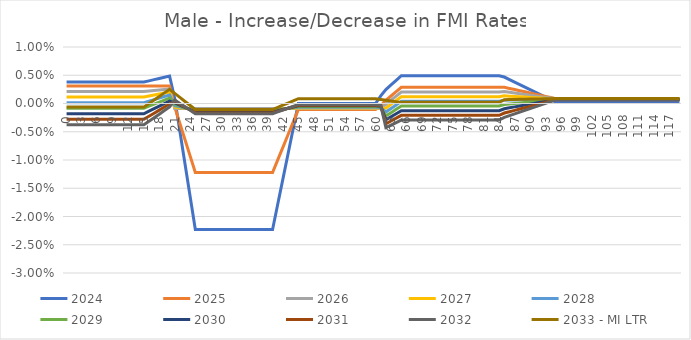
| Category | 2024 | 2025 | 2026 | 2027 | 2028 | 2029 | 2030 | 2031 | 2032 | 2033 - MI LTR |
|---|---|---|---|---|---|---|---|---|---|---|
| 0.0 | 0.004 | 0.003 | 0.002 | 0.001 | 0 | -0.001 | -0.002 | -0.003 | -0.004 | -0.001 |
| 1.0 | 0.004 | 0.003 | 0.002 | 0.001 | 0 | -0.001 | -0.002 | -0.003 | -0.004 | -0.001 |
| 2.0 | 0.004 | 0.003 | 0.002 | 0.001 | 0 | -0.001 | -0.002 | -0.003 | -0.004 | -0.001 |
| 3.0 | 0.004 | 0.003 | 0.002 | 0.001 | 0 | -0.001 | -0.002 | -0.003 | -0.004 | -0.001 |
| 4.0 | 0.004 | 0.003 | 0.002 | 0.001 | 0 | -0.001 | -0.002 | -0.003 | -0.004 | -0.001 |
| 5.0 | 0.004 | 0.003 | 0.002 | 0.001 | 0 | -0.001 | -0.002 | -0.003 | -0.004 | -0.001 |
| 6.0 | 0.004 | 0.003 | 0.002 | 0.001 | 0 | -0.001 | -0.002 | -0.003 | -0.004 | -0.001 |
| 7.0 | 0.004 | 0.003 | 0.002 | 0.001 | 0 | -0.001 | -0.002 | -0.003 | -0.004 | -0.001 |
| 8.0 | 0.004 | 0.003 | 0.002 | 0.001 | 0 | -0.001 | -0.002 | -0.003 | -0.004 | -0.001 |
| 9.0 | 0.004 | 0.003 | 0.002 | 0.001 | 0 | -0.001 | -0.002 | -0.003 | -0.004 | -0.001 |
| 10.0 | 0.004 | 0.003 | 0.002 | 0.001 | 0 | -0.001 | -0.002 | -0.003 | -0.004 | -0.001 |
| 11.0 | 0.004 | 0.003 | 0.002 | 0.001 | 0 | -0.001 | -0.002 | -0.003 | -0.004 | -0.001 |
| 12.0 | 0.004 | 0.003 | 0.002 | 0.001 | 0 | -0.001 | -0.002 | -0.003 | -0.004 | -0.001 |
| 13.0 | 0.004 | 0.003 | 0.002 | 0.001 | 0 | -0.001 | -0.002 | -0.003 | -0.004 | -0.001 |
| 14.0 | 0.004 | 0.003 | 0.002 | 0.001 | 0 | -0.001 | -0.002 | -0.003 | -0.004 | -0.001 |
| 15.0 | 0.004 | 0.003 | 0.002 | 0.001 | 0 | -0.001 | -0.002 | -0.003 | -0.004 | -0.001 |
| 16.0 | 0.004 | 0.003 | 0.002 | 0.001 | 0 | 0 | -0.001 | -0.002 | -0.003 | 0 |
| 17.0 | 0.004 | 0.003 | 0.002 | 0.001 | 0.001 | 0 | -0.001 | -0.002 | -0.003 | 0.001 |
| 18.0 | 0.004 | 0.003 | 0.002 | 0.002 | 0.001 | 0 | 0 | -0.001 | -0.002 | 0.001 |
| 19.0 | 0.005 | 0.003 | 0.002 | 0.002 | 0.001 | 0.001 | 0 | -0.001 | -0.001 | 0.002 |
| 20.0 | 0.005 | 0.003 | 0.003 | 0.002 | 0.002 | 0.001 | 0 | 0 | -0.001 | 0.003 |
| 21.0 | 0.001 | -0.001 | -0.001 | -0.001 | 0 | 0 | 0 | 0 | 0.001 | 0.002 |
| 22.0 | -0.005 | -0.004 | -0.001 | -0.001 | -0.001 | 0 | 0 | 0 | 0 | 0.001 |
| 23.0 | -0.011 | -0.006 | -0.001 | -0.001 | -0.001 | -0.001 | -0.001 | -0.001 | -0.001 | 0 |
| 24.0 | -0.017 | -0.009 | -0.001 | -0.001 | -0.001 | -0.001 | -0.001 | -0.001 | -0.001 | 0 |
| 25.0 | -0.022 | -0.012 | -0.001 | -0.001 | -0.001 | -0.001 | -0.002 | -0.002 | -0.002 | -0.001 |
| 26.0 | -0.022 | -0.012 | -0.001 | -0.001 | -0.001 | -0.001 | -0.002 | -0.002 | -0.002 | -0.001 |
| 27.0 | -0.022 | -0.012 | -0.001 | -0.001 | -0.001 | -0.001 | -0.002 | -0.002 | -0.002 | -0.001 |
| 28.0 | -0.022 | -0.012 | -0.001 | -0.001 | -0.001 | -0.001 | -0.002 | -0.002 | -0.002 | -0.001 |
| 29.0 | -0.022 | -0.012 | -0.001 | -0.001 | -0.001 | -0.001 | -0.002 | -0.002 | -0.002 | -0.001 |
| 30.0 | -0.022 | -0.012 | -0.001 | -0.001 | -0.001 | -0.001 | -0.002 | -0.002 | -0.002 | -0.001 |
| 31.0 | -0.022 | -0.012 | -0.001 | -0.001 | -0.001 | -0.001 | -0.002 | -0.002 | -0.002 | -0.001 |
| 32.0 | -0.022 | -0.012 | -0.001 | -0.001 | -0.001 | -0.001 | -0.002 | -0.002 | -0.002 | -0.001 |
| 33.0 | -0.022 | -0.012 | -0.001 | -0.001 | -0.001 | -0.001 | -0.002 | -0.002 | -0.002 | -0.001 |
| 34.0 | -0.022 | -0.012 | -0.001 | -0.001 | -0.001 | -0.001 | -0.002 | -0.002 | -0.002 | -0.001 |
| 35.0 | -0.022 | -0.012 | -0.001 | -0.001 | -0.001 | -0.001 | -0.002 | -0.002 | -0.002 | -0.001 |
| 36.0 | -0.022 | -0.012 | -0.001 | -0.001 | -0.001 | -0.001 | -0.002 | -0.002 | -0.002 | -0.001 |
| 37.0 | -0.022 | -0.012 | -0.001 | -0.001 | -0.001 | -0.001 | -0.002 | -0.002 | -0.002 | -0.001 |
| 38.0 | -0.022 | -0.012 | -0.001 | -0.001 | -0.001 | -0.001 | -0.002 | -0.002 | -0.002 | -0.001 |
| 39.0 | -0.022 | -0.012 | -0.001 | -0.001 | -0.001 | -0.001 | -0.002 | -0.002 | -0.002 | -0.001 |
| 40.0 | -0.022 | -0.012 | -0.001 | -0.001 | -0.001 | -0.001 | -0.002 | -0.002 | -0.002 | -0.001 |
| 41.0 | -0.018 | -0.01 | -0.001 | -0.001 | -0.001 | -0.001 | -0.001 | -0.001 | -0.001 | -0.001 |
| 42.0 | -0.013 | -0.008 | -0.001 | -0.001 | -0.001 | -0.001 | -0.001 | -0.001 | -0.001 | 0 |
| 43.0 | -0.009 | -0.006 | -0.001 | -0.001 | -0.001 | -0.001 | -0.001 | -0.001 | -0.001 | 0 |
| 44.0 | -0.004 | -0.003 | -0.001 | -0.001 | -0.001 | -0.001 | -0.001 | -0.001 | 0 | 0 |
| 45.0 | 0 | -0.001 | -0.001 | -0.001 | -0.001 | -0.001 | 0 | 0 | 0 | 0.001 |
| 46.0 | 0 | -0.001 | -0.001 | -0.001 | -0.001 | -0.001 | 0 | 0 | 0 | 0.001 |
| 47.0 | 0 | -0.001 | -0.001 | -0.001 | -0.001 | -0.001 | 0 | 0 | 0 | 0.001 |
| 48.0 | 0 | -0.001 | -0.001 | -0.001 | -0.001 | -0.001 | 0 | 0 | 0 | 0.001 |
| 49.0 | 0 | -0.001 | -0.001 | -0.001 | -0.001 | -0.001 | 0 | 0 | 0 | 0.001 |
| 50.0 | 0 | -0.001 | -0.001 | -0.001 | -0.001 | -0.001 | 0 | 0 | 0 | 0.001 |
| 51.0 | 0 | -0.001 | -0.001 | -0.001 | -0.001 | -0.001 | 0 | 0 | 0 | 0.001 |
| 52.0 | 0 | -0.001 | -0.001 | -0.001 | -0.001 | -0.001 | 0 | 0 | 0 | 0.001 |
| 53.0 | 0 | -0.001 | -0.001 | -0.001 | -0.001 | -0.001 | 0 | 0 | 0 | 0.001 |
| 54.0 | 0 | -0.001 | -0.001 | -0.001 | -0.001 | -0.001 | 0 | 0 | 0 | 0.001 |
| 55.0 | 0 | -0.001 | -0.001 | -0.001 | -0.001 | -0.001 | 0 | 0 | 0 | 0.001 |
| 56.0 | 0 | -0.001 | -0.001 | -0.001 | -0.001 | -0.001 | 0 | 0 | 0 | 0.001 |
| 57.0 | 0 | -0.001 | -0.001 | -0.001 | -0.001 | -0.001 | 0 | 0 | 0 | 0.001 |
| 58.0 | 0 | -0.001 | -0.001 | -0.001 | -0.001 | -0.001 | 0 | 0 | 0 | 0.001 |
| 59.0 | 0 | -0.001 | -0.001 | -0.001 | -0.001 | -0.001 | 0 | 0 | 0 | 0.001 |
| 60.0 | 0 | -0.001 | -0.001 | -0.001 | -0.001 | -0.001 | 0 | 0 | 0 | 0.001 |
| 61.0 | 0.001 | 0 | -0.001 | -0.001 | -0.001 | -0.001 | 0 | 0 | 0 | 0.001 |
| 62.0 | 0.002 | 0.001 | 0 | -0.001 | -0.002 | -0.002 | -0.003 | -0.004 | -0.004 | 0.001 |
| 63.0 | 0.003 | 0.001 | 0.001 | 0 | -0.001 | -0.002 | -0.002 | -0.003 | -0.004 | 0 |
| 64.0 | 0.004 | 0.002 | 0.001 | 0.001 | 0 | -0.001 | -0.002 | -0.003 | -0.003 | 0 |
| 65.0 | 0.005 | 0.003 | 0.002 | 0.001 | 0 | 0 | -0.001 | -0.002 | -0.003 | 0 |
| 66.0 | 0.005 | 0.003 | 0.002 | 0.001 | 0 | 0 | -0.001 | -0.002 | -0.003 | 0 |
| 67.0 | 0.005 | 0.003 | 0.002 | 0.001 | 0 | 0 | -0.001 | -0.002 | -0.003 | 0 |
| 68.0 | 0.005 | 0.003 | 0.002 | 0.001 | 0 | 0 | -0.001 | -0.002 | -0.003 | 0 |
| 69.0 | 0.005 | 0.003 | 0.002 | 0.001 | 0 | 0 | -0.001 | -0.002 | -0.003 | 0 |
| 70.0 | 0.005 | 0.003 | 0.002 | 0.001 | 0 | 0 | -0.001 | -0.002 | -0.003 | 0 |
| 71.0 | 0.005 | 0.003 | 0.002 | 0.001 | 0 | 0 | -0.001 | -0.002 | -0.003 | 0 |
| 72.0 | 0.005 | 0.003 | 0.002 | 0.001 | 0 | 0 | -0.001 | -0.002 | -0.003 | 0 |
| 73.0 | 0.005 | 0.003 | 0.002 | 0.001 | 0 | 0 | -0.001 | -0.002 | -0.003 | 0 |
| 74.0 | 0.005 | 0.003 | 0.002 | 0.001 | 0 | 0 | -0.001 | -0.002 | -0.003 | 0 |
| 75.0 | 0.005 | 0.003 | 0.002 | 0.001 | 0 | 0 | -0.001 | -0.002 | -0.003 | 0 |
| 76.0 | 0.005 | 0.003 | 0.002 | 0.001 | 0 | 0 | -0.001 | -0.002 | -0.003 | 0 |
| 77.0 | 0.005 | 0.003 | 0.002 | 0.001 | 0 | 0 | -0.001 | -0.002 | -0.003 | 0 |
| 78.0 | 0.005 | 0.003 | 0.002 | 0.001 | 0 | 0 | -0.001 | -0.002 | -0.003 | 0 |
| 79.0 | 0.005 | 0.003 | 0.002 | 0.001 | 0 | 0 | -0.001 | -0.002 | -0.003 | 0 |
| 80.0 | 0.005 | 0.003 | 0.002 | 0.001 | 0 | 0 | -0.001 | -0.002 | -0.003 | 0 |
| 81.0 | 0.005 | 0.003 | 0.002 | 0.001 | 0 | 0 | -0.001 | -0.002 | -0.003 | 0 |
| 82.0 | 0.005 | 0.003 | 0.002 | 0.001 | 0 | 0 | -0.001 | -0.002 | -0.003 | 0 |
| 83.0 | 0.005 | 0.003 | 0.002 | 0.001 | 0 | 0 | -0.001 | -0.002 | -0.003 | 0 |
| 84.0 | 0.005 | 0.003 | 0.002 | 0.001 | 0 | 0 | -0.001 | -0.002 | -0.003 | 0 |
| 85.0 | 0.005 | 0.003 | 0.002 | 0.001 | 0.001 | 0 | -0.001 | -0.002 | -0.002 | 0.001 |
| 86.0 | 0.004 | 0.003 | 0.002 | 0.001 | 0.001 | 0 | -0.001 | -0.001 | -0.002 | 0.001 |
| 87.0 | 0.004 | 0.002 | 0.002 | 0.001 | 0.001 | 0 | -0.001 | -0.001 | -0.002 | 0.001 |
| 88.0 | 0.003 | 0.002 | 0.002 | 0.001 | 0.001 | 0 | 0 | -0.001 | -0.002 | 0.001 |
| 89.0 | 0.003 | 0.002 | 0.002 | 0.001 | 0.001 | 0 | 0 | -0.001 | -0.001 | 0.001 |
| 90.0 | 0.002 | 0.002 | 0.001 | 0.001 | 0.001 | 0 | 0 | -0.001 | -0.001 | 0.001 |
| 91.0 | 0.002 | 0.002 | 0.001 | 0.001 | 0.001 | 0 | 0 | 0 | -0.001 | 0.001 |
| 92.0 | 0.002 | 0.001 | 0.001 | 0.001 | 0.001 | 0 | 0 | 0 | 0 | 0.001 |
| 93.0 | 0.001 | 0.001 | 0.001 | 0.001 | 0.001 | 0.001 | 0 | 0 | 0 | 0.001 |
| 94.0 | 0.001 | 0.001 | 0.001 | 0.001 | 0.001 | 0.001 | 0.001 | 0 | 0 | 0.001 |
| 95.0 | 0 | 0.001 | 0.001 | 0.001 | 0.001 | 0.001 | 0.001 | 0.001 | 0.001 | 0.001 |
| 96.0 | 0 | 0.001 | 0.001 | 0.001 | 0.001 | 0.001 | 0.001 | 0.001 | 0.001 | 0.001 |
| 97.0 | 0 | 0.001 | 0.001 | 0.001 | 0.001 | 0.001 | 0.001 | 0.001 | 0.001 | 0.001 |
| 98.0 | 0 | 0.001 | 0.001 | 0.001 | 0.001 | 0.001 | 0.001 | 0.001 | 0.001 | 0.001 |
| 99.0 | 0 | 0.001 | 0.001 | 0.001 | 0.001 | 0.001 | 0.001 | 0.001 | 0.001 | 0.001 |
| 100.0 | 0 | 0.001 | 0.001 | 0.001 | 0.001 | 0.001 | 0.001 | 0.001 | 0.001 | 0.001 |
| 101.0 | 0 | 0.001 | 0.001 | 0.001 | 0.001 | 0.001 | 0.001 | 0.001 | 0.001 | 0.001 |
| 102.0 | 0 | 0.001 | 0.001 | 0.001 | 0.001 | 0.001 | 0.001 | 0.001 | 0.001 | 0.001 |
| 103.0 | 0 | 0.001 | 0.001 | 0.001 | 0.001 | 0.001 | 0.001 | 0.001 | 0.001 | 0.001 |
| 104.0 | 0 | 0.001 | 0.001 | 0.001 | 0.001 | 0.001 | 0.001 | 0.001 | 0.001 | 0.001 |
| 105.0 | 0 | 0.001 | 0.001 | 0.001 | 0.001 | 0.001 | 0.001 | 0.001 | 0.001 | 0.001 |
| 106.0 | 0 | 0.001 | 0.001 | 0.001 | 0.001 | 0.001 | 0.001 | 0.001 | 0.001 | 0.001 |
| 107.0 | 0 | 0.001 | 0.001 | 0.001 | 0.001 | 0.001 | 0.001 | 0.001 | 0.001 | 0.001 |
| 108.0 | 0 | 0.001 | 0.001 | 0.001 | 0.001 | 0.001 | 0.001 | 0.001 | 0.001 | 0.001 |
| 109.0 | 0 | 0.001 | 0.001 | 0.001 | 0.001 | 0.001 | 0.001 | 0.001 | 0.001 | 0.001 |
| 110.0 | 0 | 0.001 | 0.001 | 0.001 | 0.001 | 0.001 | 0.001 | 0.001 | 0.001 | 0.001 |
| 111.0 | 0 | 0.001 | 0.001 | 0.001 | 0.001 | 0.001 | 0.001 | 0.001 | 0.001 | 0.001 |
| 112.0 | 0 | 0.001 | 0.001 | 0.001 | 0.001 | 0.001 | 0.001 | 0.001 | 0.001 | 0.001 |
| 113.0 | 0 | 0.001 | 0.001 | 0.001 | 0.001 | 0.001 | 0.001 | 0.001 | 0.001 | 0.001 |
| 114.0 | 0 | 0.001 | 0.001 | 0.001 | 0.001 | 0.001 | 0.001 | 0.001 | 0.001 | 0.001 |
| 115.0 | 0 | 0.001 | 0.001 | 0.001 | 0.001 | 0.001 | 0.001 | 0.001 | 0.001 | 0.001 |
| 116.0 | 0 | 0.001 | 0.001 | 0.001 | 0.001 | 0.001 | 0.001 | 0.001 | 0.001 | 0.001 |
| 117.0 | 0 | 0.001 | 0.001 | 0.001 | 0.001 | 0.001 | 0.001 | 0.001 | 0.001 | 0.001 |
| 118.0 | 0 | 0.001 | 0.001 | 0.001 | 0.001 | 0.001 | 0.001 | 0.001 | 0.001 | 0.001 |
| 119.0 | 0 | 0.001 | 0.001 | 0.001 | 0.001 | 0.001 | 0.001 | 0.001 | 0.001 | 0.001 |